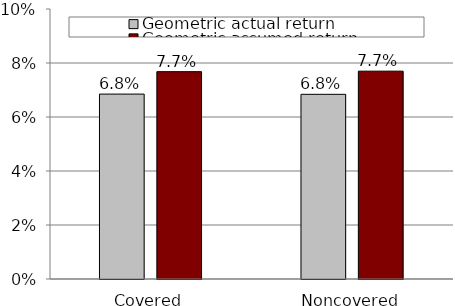
| Category | Geometric actual return | Geometric assumed return |
|---|---|---|
| Covered | 0.068 | 0.077 |
| Noncovered | 0.068 | 0.077 |